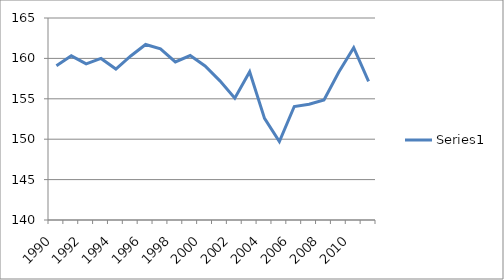
| Category | Series 0 |
|---|---|
| 1990.0 | 159.079 |
| 1991.0 | 160.319 |
| 1992.0 | 159.321 |
| 1993.0 | 159.997 |
| 1994.0 | 158.68 |
| 1995.0 | 160.297 |
| 1996.0 | 161.726 |
| 1997.0 | 161.182 |
| 1998.0 | 159.562 |
| 1999.0 | 160.357 |
| 2000.0 | 159.069 |
| 2001.0 | 157.222 |
| 2002.0 | 155.074 |
| 2003.0 | 158.354 |
| 2004.0 | 152.572 |
| 2005.0 | 149.705 |
| 2006.0 | 154.044 |
| 2007.0 | 154.322 |
| 2008.0 | 154.844 |
| 2009.0 | 158.322 |
| 2010.0 | 161.333 |
| 2011.0 | 157.156 |